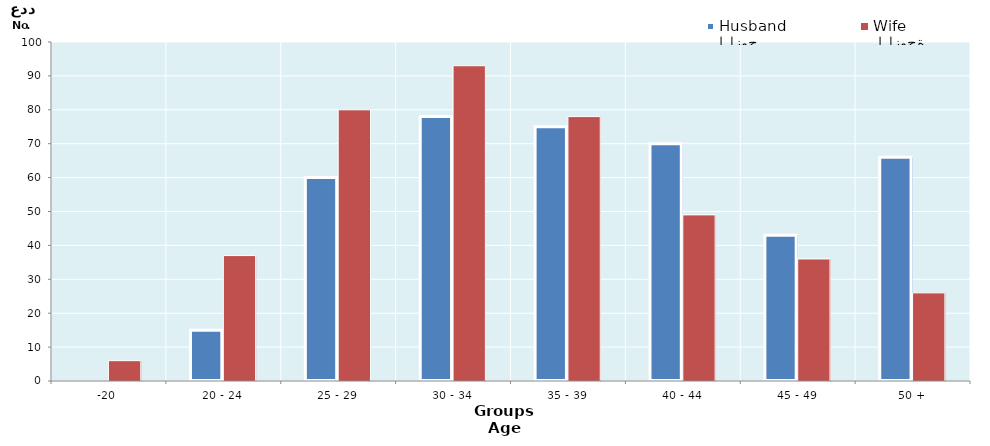
| Category | الزوج
Husband |  الزوجة
Wife |
|---|---|---|
| -20 | 0 | 6 |
| 20 - 24 | 15 | 37 |
| 25 - 29 | 60 | 80 |
| 30 - 34 | 78 | 93 |
| 35 - 39 | 75 | 78 |
| 40 - 44 | 70 | 49 |
| 45 - 49 | 43 | 36 |
| 50 + | 66 | 26 |